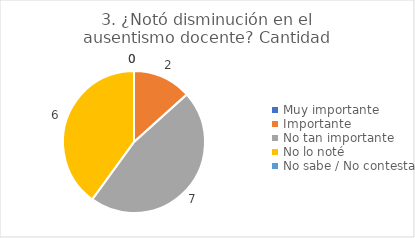
| Category | 3. ¿Notó disminución en el ausentismo docente? |
|---|---|
| Muy importante  | 0 |
| Importante  | 0.133 |
| No tan importante  | 0.467 |
| No lo noté  | 0.4 |
| No sabe / No contesta | 0 |